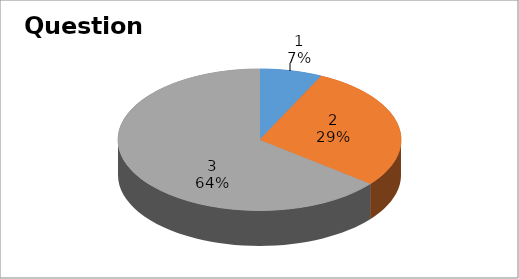
| Category | Series 0 |
|---|---|
| 0 | 1 |
| 1 | 4 |
| 2 | 9 |